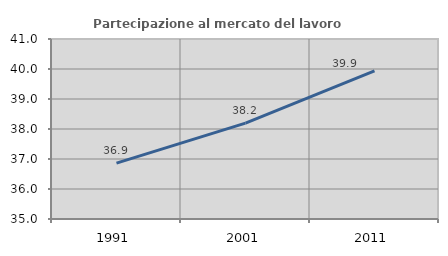
| Category | Partecipazione al mercato del lavoro  femminile |
|---|---|
| 1991.0 | 36.861 |
| 2001.0 | 38.195 |
| 2011.0 | 39.941 |